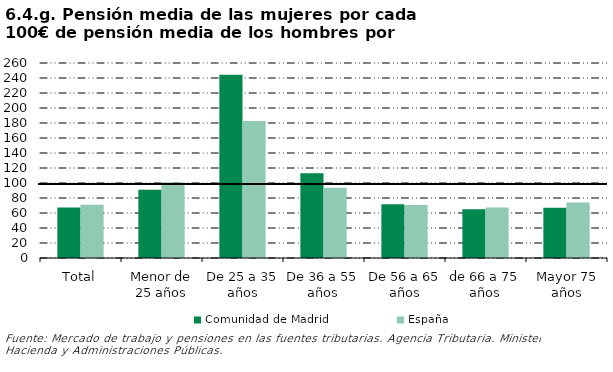
| Category | Comunidad de Madrid | España |
|---|---|---|
| Total | 67.409 | 71.057 |
| Menor de 25 años | 90.969 | 100.514 |
| De 25 a 35 años | 244.414 | 182.655 |
| De 36 a 55 años | 112.985 | 93.715 |
| De 56 a 65 años | 71.691 | 70.712 |
| de 66 a 75 años | 64.938 | 67.262 |
| Mayor 75 años | 66.872 | 74.071 |